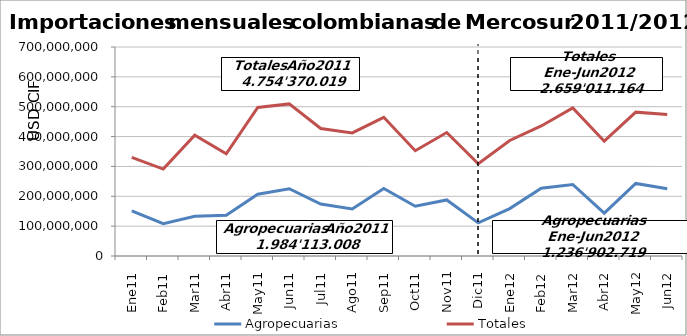
| Category | Agropecuarias | Totales |
|---|---|---|
| 0 | 150925249.84 | 330160374.31 |
| 1 | 108024479.28 | 291067927.3 |
| 2 | 133345497.31 | 404751248.07 |
| 3 | 136735607.5 | 342519702.37 |
| 4 | 206739251.41 | 497485870.25 |
| 5 | 225322202.73 | 509449724.22 |
| 6 | 174050079.66 | 426938982.95 |
| 7 | 157284996.77 | 412210100.53 |
| 8 | 226108411.68 | 464582861.48 |
| 9 | 166832991.94 | 352686344.97 |
| 10 | 187700133.66 | 413490004.37 |
| 11 | 111044106.57 | 309026878.56 |
| 12 | 158698993.64 | 386883999.34 |
| 13 | 226970222.38 | 435613049.98 |
| 14 | 239514344.1 | 496092136.99 |
| 15 | 143346818.17 | 384553222.89 |
| 16 | 243104775.43 | 481845222.24 |
| 17 | 225267564.78 | 474023532.58 |